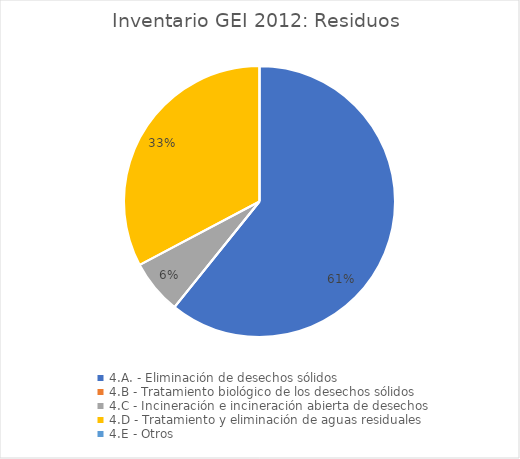
| Category | Series 0 |
|---|---|
| 4.A. - Eliminación de desechos sólidos | 1134 |
| 4.B - Tratamiento biológico de los desechos sólidos | 0.064 |
| 4.C - Incineración e incineración abierta de desechos | 120.53 |
| 4.D - Tratamiento y eliminación de aguas residuales | 610.92 |
| 4.E - Otros | 0 |